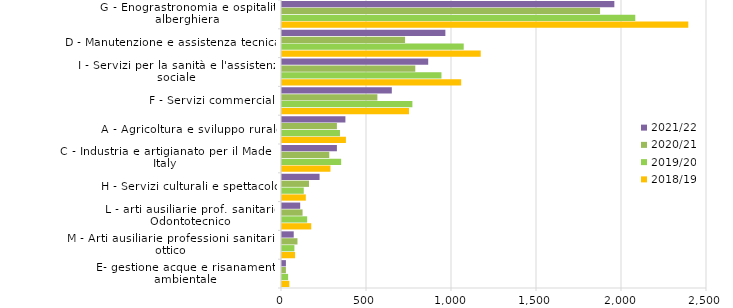
| Category | 2018/19 | 2019/20 | 2020/21 | 2021/22 |
|---|---|---|---|---|
| E- gestione acque e risanamento ambientale | 43 | 36 | 23 | 23 |
| M - Arti ausiliarie professioni sanitarie: ottico | 77 | 73 | 91 | 69 |
| L - arti ausiliarie prof. sanitarie: Odontotecnico | 172 | 148 | 121 | 107 |
| H - Servizi culturali e spettacolo | 140 | 128 | 159 | 221 |
| C - Industria e artigianato per il Made in Italy  | 285 | 348 | 278 | 323 |
| A - Agricoltura e sviluppo rurale | 376 | 341 | 323 | 373 |
| F - Servizi commerciali | 747 | 767 | 561 | 646 |
| I - Servizi per la sanità e l'assistenza sociale | 1054 | 938 | 784 | 860 |
| D - Manutenzione e assistenza tecnica | 1169 | 1069 | 724 | 961 |
| G - Enograstronomia e ospitalità alberghiera | 2390 | 2078 | 1871 | 1955 |